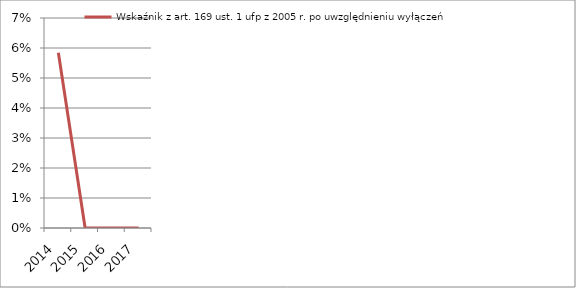
| Category | Wskaźnik z art. 169 ust. 1 ufp z 2005 r. po uwzględnieniu wyłączeń |
|---|---|
| 2014.0 | 0.058 |
| 2015.0 | 0 |
| 2016.0 | 0 |
| 2017.0 | 0 |